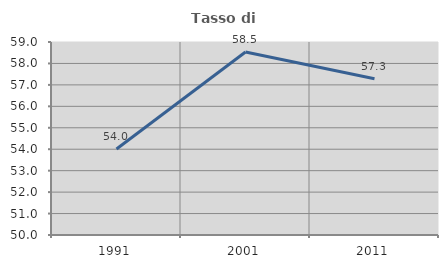
| Category | Tasso di occupazione   |
|---|---|
| 1991.0 | 54.011 |
| 2001.0 | 58.532 |
| 2011.0 | 57.284 |